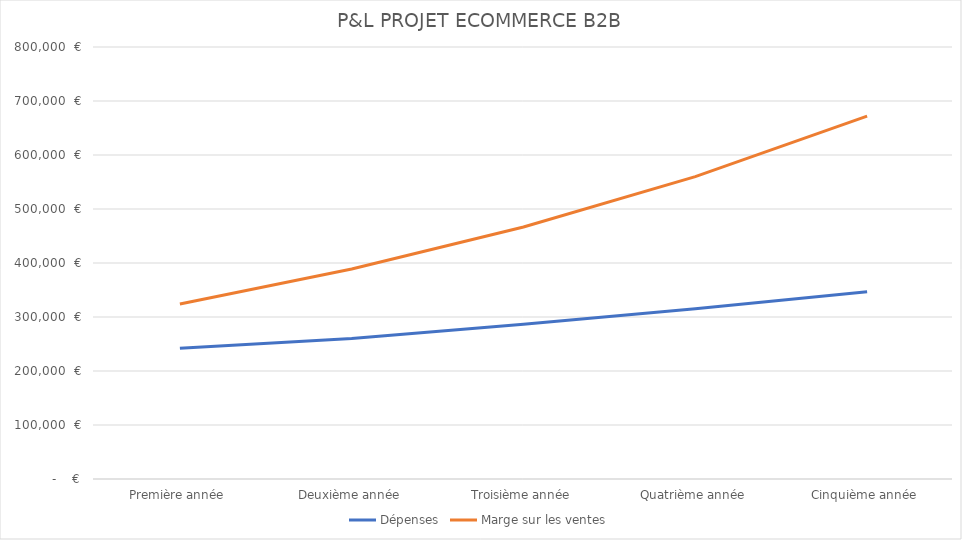
| Category | Dépenses | Marge sur les ventes |
|---|---|---|
| Première année | 241918 | 324000 |
| Deuxième année | 260388 | 388800 |
| Troisième année | 286426.8 | 466560 |
| Quatrième année | 315069.48 | 559872 |
| Cinquième année | 346576.428 | 671846.4 |